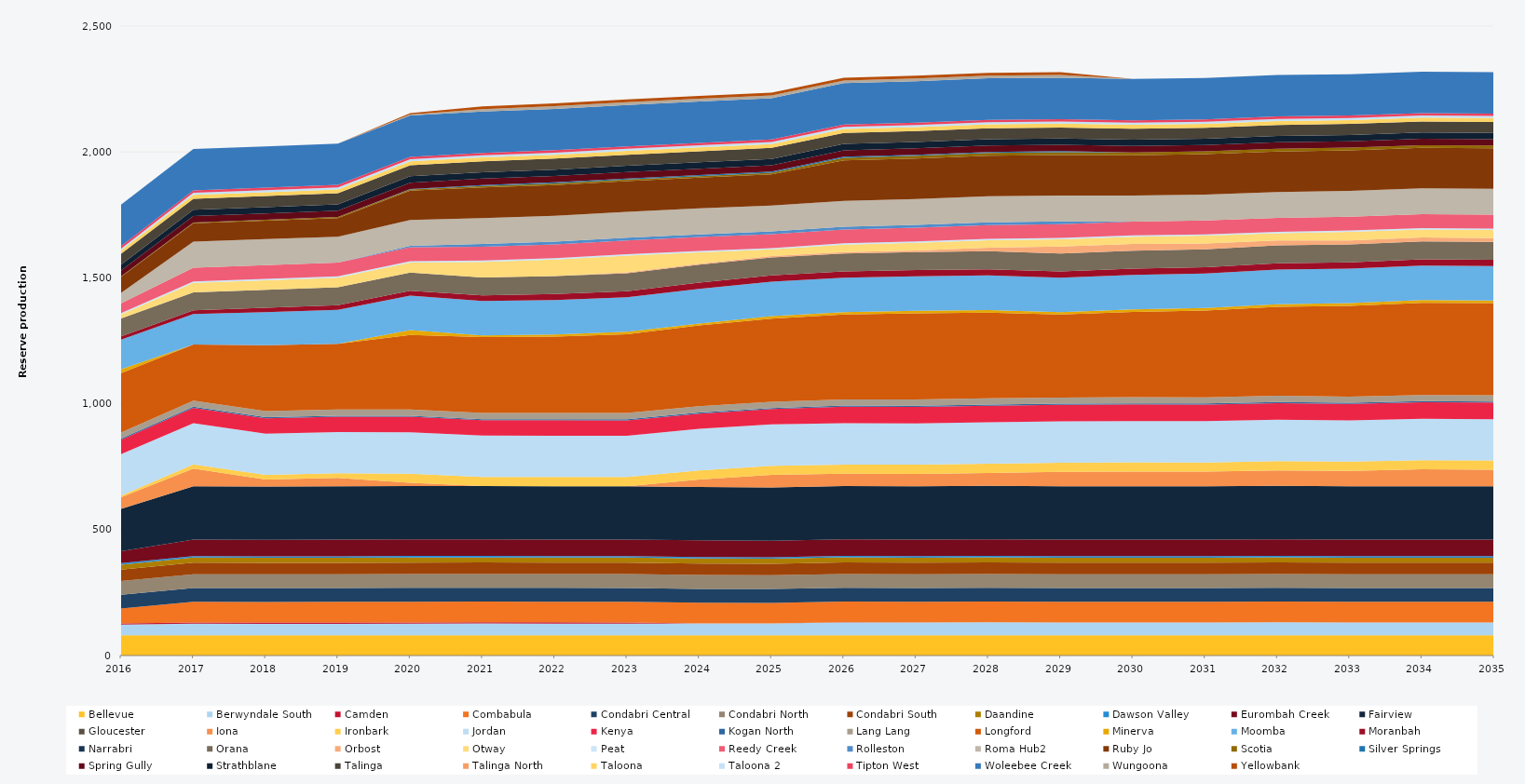
| Category | Bellevue | Berwyndale South | Camden | Combabula | Condabri Central | Condabri North | Condabri South | Daandine | Dawson Valley | Eurombah Creek | Fairview | Gloucester | Iona | Ironbark | Jordan | Kenya | Kogan North | Lang Lang | Longford | Minerva | Moomba | Moranbah | Narrabri | Orana | Orbost | Otway | Peat | Reedy Creek | Rolleston | Roma Hub2 | Ruby Jo | Scotia | Silver Springs | Spring Gully | Strathblane | Talinga | Talinga North | Taloona | Taloona 2 | Tipton West | Woleebee Creek | Wungoona | Yellowbank |
|---|---|---|---|---|---|---|---|---|---|---|---|---|---|---|---|---|---|---|---|---|---|---|---|---|---|---|---|---|---|---|---|---|---|---|---|---|---|---|---|---|---|---|---|
| 2016 | 80.52 | 41.998 | 5 | 59.307 | 54.403 | 54.604 | 44.974 | 20.13 | 5.856 | 47.032 | 168.408 | 0 | 46.799 | 5.693 | 164.7 | 57.692 | 4.392 | 24.522 | 235.041 | 16 | 117.222 | 13.152 | 0 | 71.044 | 0 | 15.606 | 5.49 | 39.238 | 0 | 41.654 | 64.114 | 1.447 | 0 | 23.055 | 22.903 | 43.421 | 0 | 13.515 | 7.501 | 9.516 | 164.7 | 0 | 0 |
| 2017 | 80.3 | 46.164 | 5 | 82.125 | 54.75 | 54.75 | 45.625 | 20.075 | 5.84 | 65.7 | 211.7 | 0 | 70.439 | 16.208 | 164.25 | 60.89 | 4.38 | 24.455 | 222.562 | 0 | 121.164 | 14.795 | 0 | 71.175 | 0 | 38 | 5.475 | 54.75 | 0 | 102.93 | 73.702 | 2.857 | 0 | 25.185 | 25.185 | 43.8 | 0 | 15.33 | 8.395 | 9.49 | 164.25 | 0 | 0 |
| 2018 | 80.3 | 45.557 | 5 | 82.125 | 54.75 | 54.75 | 45.625 | 20.075 | 5.84 | 65.7 | 211.7 | 0 | 27.379 | 18.199 | 164.25 | 60.67 | 4.38 | 24.455 | 261.823 | 0 | 130.69 | 17.982 | 0 | 71.175 | 0 | 38 | 5.475 | 54.75 | 0 | 102.93 | 73.702 | 3.42 | 0 | 25.185 | 25.185 | 43.8 | 0 | 15.33 | 8.395 | 9.49 | 164.25 | 0 | 0 |
| 2019 | 80.3 | 45.844 | 5 | 82.125 | 54.75 | 54.75 | 45.625 | 20.075 | 5.84 | 65.7 | 211.7 | 0 | 33.563 | 18.25 | 164.25 | 60.579 | 4.38 | 24.455 | 260.814 | 0 | 135.337 | 18.049 | 0 | 71.175 | 0 | 38 | 5.475 | 54.75 | 0 | 102.93 | 73.702 | 4.343 | 0 | 25.185 | 25.185 | 43.8 | 0 | 15.33 | 8.395 | 9.49 | 164.25 | 0 | 0 |
| 2020 | 80.52 | 45.915 | 5 | 82.35 | 54.9 | 54.9 | 45.75 | 20.13 | 5.856 | 65.88 | 212.28 | 0 | 12.08 | 36.6 | 164.7 | 61.342 | 4.392 | 24.522 | 295.556 | 19.609 | 137.25 | 19.619 | 0 | 71.37 | 0 | 40.407 | 5.49 | 54.9 | 5.65 | 103.212 | 116.254 | 4.85 | 1.408 | 25.254 | 25.254 | 43.92 | 0 | 15.372 | 8.418 | 9.516 | 164.7 | 3.855 | 5.598 |
| 2021 | 80.3 | 46.905 | 5 | 82.125 | 54.75 | 54.75 | 45.625 | 20.075 | 5.84 | 65.7 | 211.7 | 0 | 0 | 36.5 | 164.25 | 60.853 | 4.38 | 24.455 | 301.268 | 7.191 | 136.875 | 22.179 | 0 | 71.175 | 0 | 61.407 | 5.475 | 54.75 | 10.95 | 102.93 | 121.796 | 5.911 | 3.781 | 25.185 | 25.185 | 43.8 | 0 | 15.33 | 8.395 | 9.49 | 164.25 | 9.425 | 10.95 |
| 2022 | 80.3 | 46.453 | 5 | 82.125 | 54.75 | 54.75 | 45.625 | 20.075 | 5.84 | 65.7 | 211.7 | 0 | 0 | 36.5 | 164.25 | 61.365 | 4.38 | 24.455 | 303.647 | 7.872 | 136.875 | 24.141 | 0 | 71.175 | 0 | 65.811 | 5.475 | 54.75 | 10.95 | 102.93 | 121.752 | 6.356 | 4.38 | 25.185 | 25.185 | 43.8 | 0 | 15.33 | 8.395 | 9.49 | 164.25 | 10.95 | 10.95 |
| 2023 | 80.3 | 46.333 | 5 | 82.125 | 54.75 | 54.75 | 45.625 | 20.075 | 5.84 | 65.7 | 211.7 | 0 | 0 | 36.5 | 164.25 | 61.186 | 4.38 | 24.455 | 312.649 | 10.079 | 136.875 | 24.787 | 0 | 71.175 | 3.645 | 66.376 | 5.475 | 54.75 | 10.95 | 102.93 | 121.708 | 6.125 | 4.38 | 25.185 | 25.185 | 43.8 | 0 | 15.33 | 8.395 | 9.49 | 164.25 | 10.95 | 10.95 |
| 2024 | 80.52 | 46.934 | 0 | 82.35 | 54.9 | 54.9 | 45.75 | 20.13 | 5.856 | 65.88 | 212.28 | 0 | 29.268 | 36.6 | 164.7 | 60.981 | 4.392 | 24.522 | 320.648 | 8.071 | 137.25 | 24.888 | 0 | 71.37 | 4.054 | 45.269 | 5.49 | 54.9 | 10.98 | 103.212 | 121.963 | 5.756 | 4.392 | 25.254 | 25.254 | 43.92 | 0 | 15.372 | 8.418 | 9.516 | 164.7 | 10.98 | 10.98 |
| 2025 | 80.3 | 46.941 | 0 | 82.125 | 54.75 | 54.75 | 45.625 | 20.075 | 5.84 | 65.7 | 211.7 | 0 | 49.346 | 36.5 | 164.25 | 60.957 | 4.38 | 24.455 | 330.375 | 10.004 | 136.875 | 24.82 | 0 | 71.175 | 6.025 | 25.976 | 5.475 | 54.75 | 10.95 | 102.93 | 124.413 | 6.244 | 4.38 | 25.185 | 25.185 | 43.8 | 0 | 15.33 | 8.395 | 9.49 | 164.25 | 10.95 | 10.95 |
| 2026 | 80.3 | 51.1 | 1 | 82.125 | 54.75 | 54.75 | 45.625 | 20.075 | 5.84 | 65.7 | 211.7 | 0 | 48.981 | 36.5 | 164.25 | 65.7 | 4.38 | 24.455 | 337.029 | 9.296 | 136.875 | 24.82 | 0 | 71.175 | 6.043 | 28.993 | 5.475 | 54.75 | 10.95 | 102.93 | 160.6 | 10.95 | 4.38 | 25.185 | 25.185 | 43.8 | 0 | 15.33 | 8.395 | 9.49 | 164.25 | 10.95 | 10.95 |
| 2027 | 80.3 | 51.1 | 0 | 82.125 | 54.75 | 54.75 | 45.625 | 20.075 | 5.84 | 65.7 | 211.7 | 0 | 49.435 | 36.5 | 164.25 | 65.7 | 4.38 | 24.455 | 342.614 | 9.851 | 136.875 | 24.82 | 0 | 71.175 | 6.652 | 30.449 | 5.475 | 54.75 | 10.95 | 102.93 | 160.6 | 10.95 | 4.38 | 25.185 | 25.185 | 43.8 | 0 | 15.33 | 8.395 | 9.49 | 164.25 | 10.95 | 10.95 |
| 2028 | 80.52 | 51.24 | 0 | 82.35 | 54.9 | 54.9 | 45.75 | 20.13 | 5.856 | 65.88 | 212.28 | 0 | 51.481 | 36.6 | 164.7 | 65.88 | 4.392 | 24.522 | 340.795 | 9.929 | 137.25 | 24.888 | 0 | 71.37 | 13.798 | 29.704 | 5.49 | 54.9 | 10.98 | 103.212 | 161.04 | 10.98 | 4.392 | 25.254 | 25.254 | 43.92 | 0 | 15.372 | 8.418 | 9.516 | 164.7 | 10.98 | 10.98 |
| 2029 | 80.3 | 51.1 | 0 | 82.125 | 54.75 | 54.75 | 45.625 | 20.075 | 5.84 | 65.7 | 211.7 | 0 | 57.324 | 36.5 | 164.25 | 65.7 | 4.38 | 24.455 | 329.882 | 9.495 | 136.875 | 24.82 | 0 | 71.175 | 27.375 | 28.944 | 5.475 | 54.75 | 10.893 | 102.93 | 160.6 | 10.95 | 4.38 | 25.185 | 25.185 | 43.8 | 0 | 15.33 | 8.395 | 9.49 | 164.25 | 10.95 | 10.86 |
| 2030 | 80.3 | 51.1 | 0 | 82.125 | 54.75 | 54.75 | 45.625 | 20.075 | 5.84 | 65.7 | 211.7 | 0 | 58.752 | 36.5 | 164.25 | 65.7 | 4.38 | 24.455 | 338.656 | 10.036 | 136.875 | 24.82 | 0 | 71.175 | 27.375 | 28.618 | 5.475 | 54.75 | 0 | 102.93 | 160.6 | 10.95 | 0 | 25.185 | 25.185 | 43.8 | 0 | 15.33 | 8.395 | 9.49 | 164.25 | 0 | 0 |
| 2031 | 80.3 | 51.1 | 0 | 82.125 | 54.75 | 54.75 | 45.625 | 20.075 | 5.84 | 65.7 | 211.7 | 0 | 58.243 | 36.5 | 164.25 | 65.7 | 4.38 | 24.455 | 345.041 | 10.07 | 136.875 | 24.82 | 0 | 71.175 | 23.302 | 30.726 | 5.475 | 54.75 | 0 | 102.93 | 160.6 | 10.95 | 0 | 25.185 | 25.185 | 43.8 | 0 | 15.33 | 8.395 | 9.49 | 164.25 | 0 | 0 |
| 2032 | 80.52 | 51.24 | 0 | 82.35 | 54.9 | 54.9 | 45.75 | 20.13 | 5.856 | 65.88 | 212.28 | 0 | 61.64 | 36.6 | 164.7 | 65.88 | 4.392 | 24.522 | 353.221 | 10.796 | 137.25 | 24.888 | 0 | 71.37 | 19.261 | 29.143 | 5.49 | 54.9 | 0 | 103.212 | 161.04 | 10.98 | 0 | 25.254 | 25.254 | 43.92 | 0 | 15.372 | 8.418 | 9.516 | 164.7 | 0 | 0 |
| 2033 | 80.3 | 51.1 | 0 | 82.125 | 54.75 | 54.75 | 45.625 | 20.075 | 5.84 | 65.7 | 211.7 | 0 | 61.243 | 36.5 | 164.25 | 65.7 | 4.38 | 24.455 | 360.471 | 10.685 | 136.875 | 24.82 | 0 | 71.175 | 15.707 | 34.227 | 5.475 | 54.75 | 0 | 102.93 | 160.6 | 10.95 | 0 | 25.185 | 25.185 | 43.8 | 0 | 15.33 | 8.395 | 9.49 | 164.25 | 0 | 0 |
| 2034 | 80.3 | 51.1 | 0 | 82.125 | 54.75 | 54.75 | 45.625 | 20.075 | 5.84 | 65.7 | 211.7 | 0 | 67.362 | 36.5 | 164.25 | 65.7 | 4.38 | 24.455 | 365.789 | 11.131 | 136.875 | 24.82 | 0 | 71.175 | 15.711 | 32.248 | 5.475 | 54.75 | 0 | 102.93 | 160.6 | 10.95 | 0 | 25.185 | 25.185 | 43.8 | 0 | 15.33 | 8.395 | 9.49 | 164.25 | 0 | 0 |
| 2035 | 80.3 | 51.1 | 0 | 82.125 | 54.75 | 54.75 | 45.625 | 20.075 | 5.84 | 65.7 | 211.7 | 0 | 66.15 | 36.5 | 164.25 | 65.7 | 4.38 | 24.455 | 366.262 | 10.675 | 136.875 | 24.82 | 0 | 71.175 | 14.877 | 32.439 | 5.475 | 54.75 | 0 | 102.93 | 160.6 | 10.95 | 0 | 25.185 | 25.185 | 43.8 | 0 | 15.33 | 8.395 | 9.49 | 164.25 | 0 | 0 |